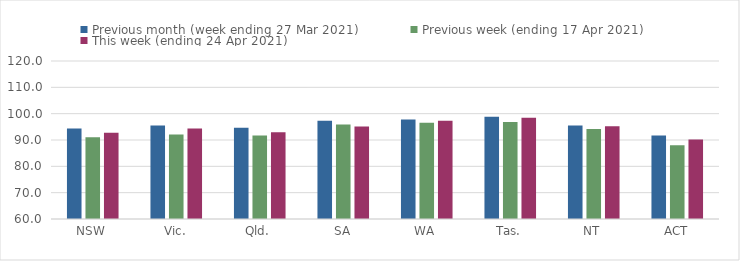
| Category | Previous month (week ending 27 Mar 2021) | Previous week (ending 17 Apr 2021) | This week (ending 24 Apr 2021) |
|---|---|---|---|
| NSW | 94.41 | 91.06 | 92.74 |
| Vic. | 95.48 | 92.13 | 94.4 |
| Qld. | 94.67 | 91.68 | 92.91 |
| SA | 97.28 | 95.93 | 95.1 |
| WA | 97.81 | 96.58 | 97.3 |
| Tas. | 98.86 | 96.79 | 98.48 |
| NT | 95.54 | 94.13 | 95.21 |
| ACT | 91.67 | 87.99 | 90.18 |